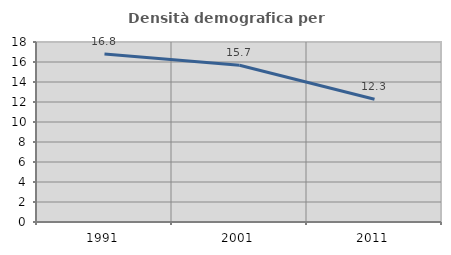
| Category | Densità demografica |
|---|---|
| 1991.0 | 16.8 |
| 2001.0 | 15.668 |
| 2011.0 | 12.274 |